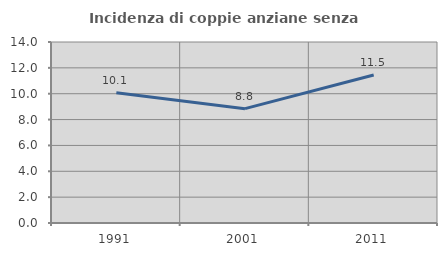
| Category | Incidenza di coppie anziane senza figli  |
|---|---|
| 1991.0 | 10.067 |
| 2001.0 | 8.844 |
| 2011.0 | 11.45 |